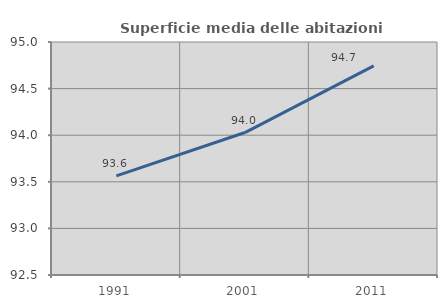
| Category | Superficie media delle abitazioni occupate |
|---|---|
| 1991.0 | 93.564 |
| 2001.0 | 94.028 |
| 2011.0 | 94.744 |